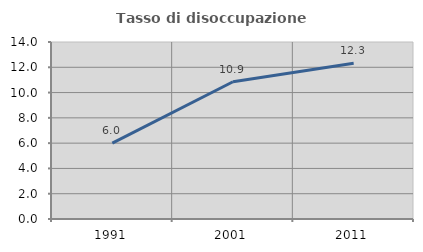
| Category | Tasso di disoccupazione giovanile  |
|---|---|
| 1991.0 | 6 |
| 2001.0 | 10.857 |
| 2011.0 | 12.319 |